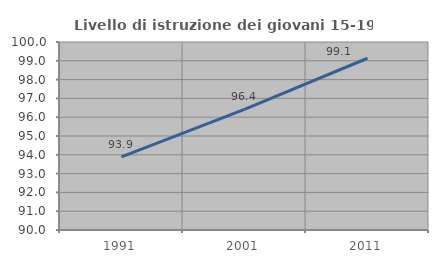
| Category | Livello di istruzione dei giovani 15-19 anni |
|---|---|
| 1991.0 | 93.891 |
| 2001.0 | 96.417 |
| 2011.0 | 99.135 |